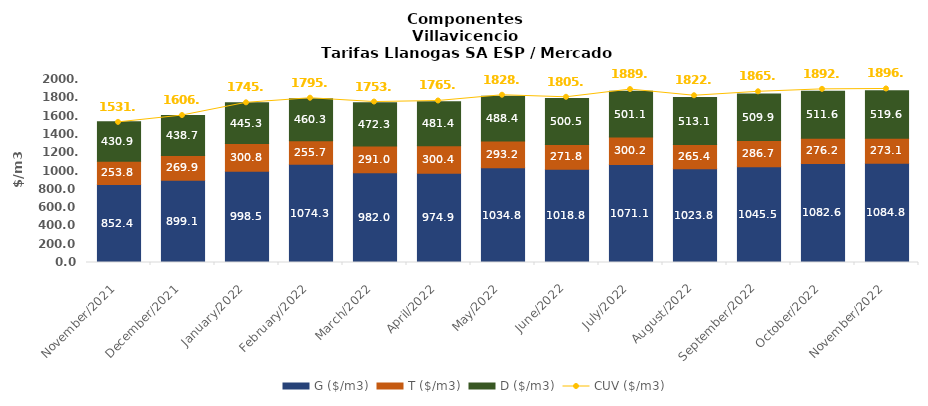
| Category | G ($/m3) | T ($/m3) | D ($/m3) |
|---|---|---|---|
| 2021-11-01 | 852.41 | 253.84 | 430.85 |
| 2021-12-01 | 899.1 | 269.91 | 438.66 |
| 2022-01-01 | 998.53 | 300.84 | 445.28 |
| 2022-02-01 | 1074.31 | 255.71 | 460.33 |
| 2022-03-01 | 981.99 | 290.95 | 472.3 |
| 2022-04-01 | 974.88 | 300.4 | 481.41 |
| 2022-05-01 | 1034.82 | 293.23 | 488.41 |
| 2022-06-01 | 1018.78 | 271.84 | 500.5 |
| 2022-07-01 | 1071.1 | 300.23 | 501.07 |
| 2022-08-01 | 1023.83 | 265.35 | 513.09 |
| 2022-09-01 | 1045.5 | 286.69 | 509.94 |
| 2022-10-01 | 1082.55 | 276.23 | 511.58 |
| 2022-11-01 | 1084.79 | 273.13 | 519.57 |